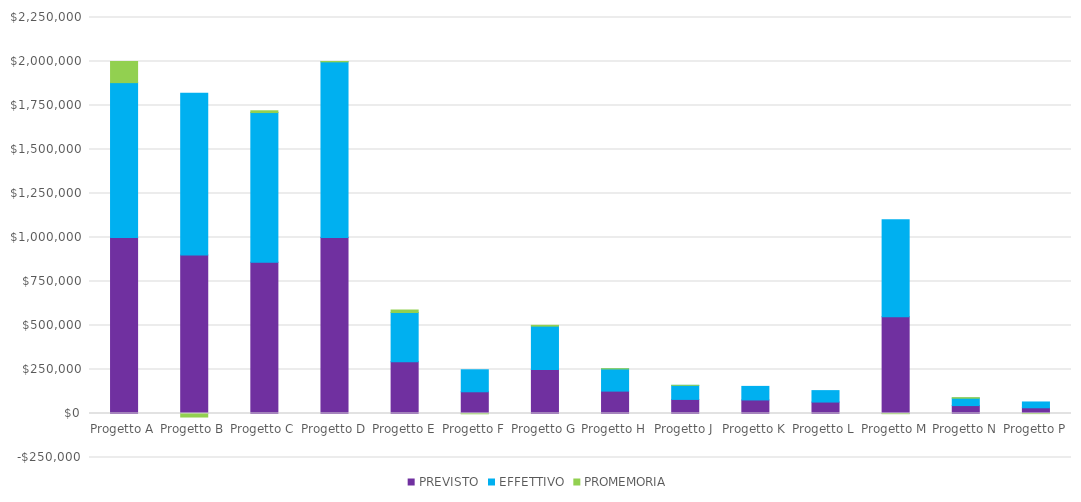
| Category | PREVISTO | EFFETTIVO | PROMEMORIA |
|---|---|---|---|
| Progetto A | 1000000 | 880000 | 120000 |
| Progetto B | 900000 | 920000 | -20000 |
| Progetto C | 860000 | 850000 | 10000 |
| Progetto D | 1000000 | 998050 | 1950 |
| Progetto E | 294000 | 280000 | 14000 |
| Progetto F | 123400 | 125000 | -1600 |
| Progetto G | 250500 | 246000 | 4500 |
| Progetto H | 127200 | 126000 | 1200 |
| Progetto J | 80000 | 79900 | 100 |
| Progetto K | 77000 | 77000 | 0 |
| Progetto L | 65000 | 65000 | 0 |
| Progetto M | 550000 | 551000 | -1000 |
| Progetto N | 45000 | 42000 | 3000 |
| Progetto P | 32500 | 33000 | -500 |